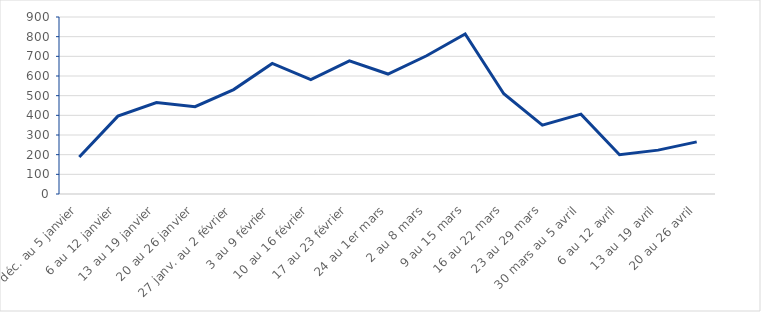
| Category | Series 0 |
|---|---|
| 30 déc. au 5 janvier | 188 |
| 6 au 12 janvier | 396 |
| 13 au 19 janvier | 465 |
| 20 au 26 janvier | 444 |
| 27 janv. au 2 février | 531 |
| 3 au 9 février | 664 |
| 10 au 16 février | 582 |
| 17 au 23 février | 677 |
| 24 au 1er mars | 610 |
| 2 au 8 mars | 703 |
| 9 au 15 mars | 814 |
| 16 au 22 mars | 510 |
| 23 au 29 mars | 350 |
| 30 mars au 5 avril | 406 |
| 6 au 12 avril | 200 |
| 13 au 19 avril | 223 |
| 20 au 26 avril | 265 |